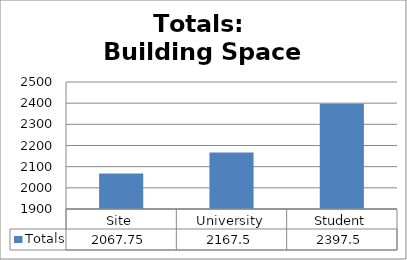
| Category | Totals |
|---|---|
| Site | 2067.75 |
| University | 2167.5 |
| Student | 2397.5 |